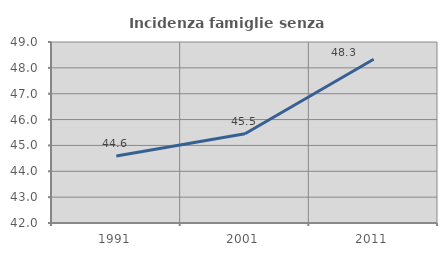
| Category | Incidenza famiglie senza nuclei |
|---|---|
| 1991.0 | 44.595 |
| 2001.0 | 45.455 |
| 2011.0 | 48.333 |